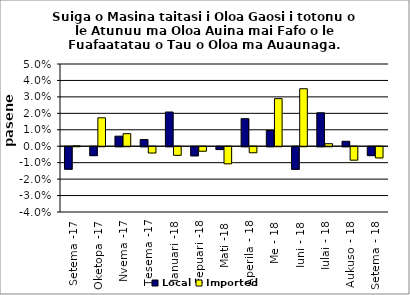
| Category | Local | Imported |
|---|---|---|
| Setema -17 | -0.014 | 0 |
| Oketopa -17 | -0.005 | 0.017 |
| Nvema -17 | 0.006 | 0.008 |
| Tesema -17 | 0.004 | -0.004 |
| Ianuari -18 | 0.021 | -0.005 |
| Fepuari -18 | -0.006 | -0.003 |
| Mati -18 | -0.002 | -0.01 |
| Aperila - 18 | 0.017 | -0.004 |
| Me - 18 | 0.01 | 0.029 |
| Iuni - 18 | -0.014 | 0.035 |
| Iulai - 18 | 0.02 | 0.002 |
| Aukuso - 18 | 0.003 | -0.008 |
| Setema - 18 | -0.005 | -0.007 |